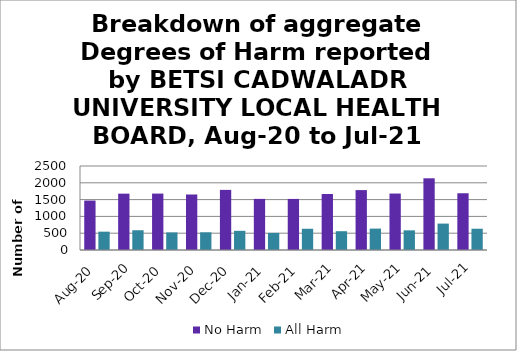
| Category | No Harm | All Harm |
|---|---|---|
| Aug-20 | 1471 | 546 |
| Sep-20 | 1677 | 588 |
| Oct-20 | 1679 | 523 |
| Nov-20 | 1652 | 526 |
| Dec-20 | 1789 | 571 |
| Jan-21 | 1521 | 509 |
| Feb-21 | 1520 | 632 |
| Mar-21 | 1667 | 559 |
| Apr-21 | 1783 | 637 |
| May-21 | 1680 | 585 |
| Jun-21 | 2134 | 786 |
| Jul-21 | 1689 | 633 |